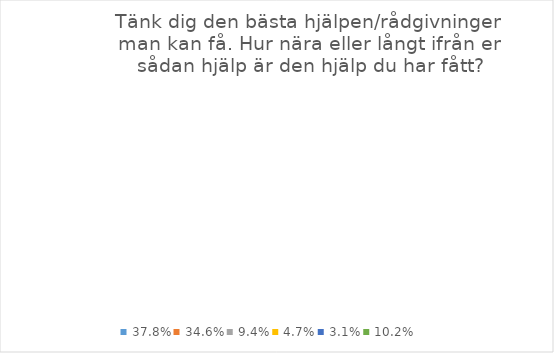
| Category | Series 0 |
|---|---|
| 0.3779527559055118 | 0 |
| 0.3464566929133858 | 0 |
| 0.09448818897637795 | 0 |
| 0.047244094488188976 | 0 |
| 0.031496062992125984 | 0 |
| 0.10236220472440945 | 0 |